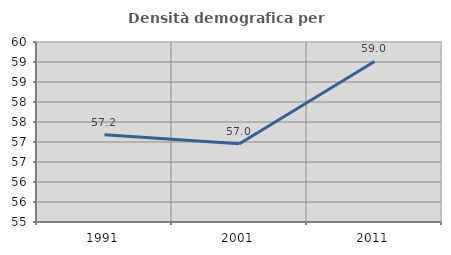
| Category | Densità demografica |
|---|---|
| 1991.0 | 57.18 |
| 2001.0 | 56.956 |
| 2011.0 | 59.015 |